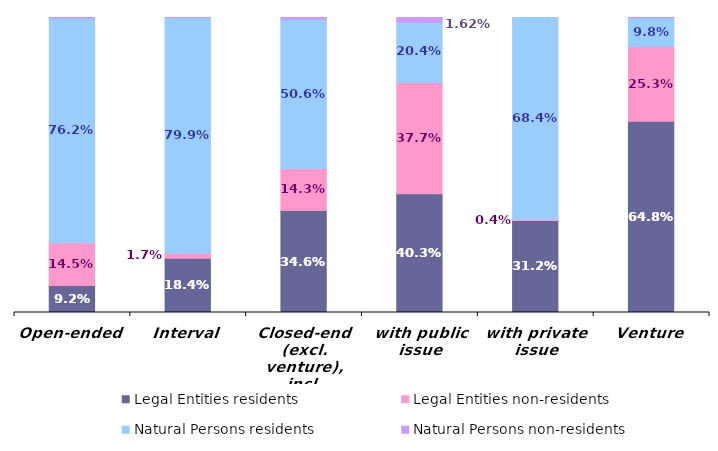
| Category | Legal Entities | Natural Persons |
|---|---|---|
| Open-ended | 0.145 | 0.002 |
| Interval | 0.017 | 0 |
| Closed-end (excl. venture), incl. | 0.143 | 0.006 |
| with public issue | 0.377 | 0.016 |
| with private issue | 0.004 | 0 |
| Venture | 0.253 | 0.001 |